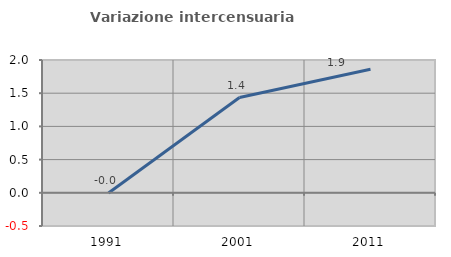
| Category | Variazione intercensuaria annua |
|---|---|
| 1991.0 | -0.004 |
| 2001.0 | 1.434 |
| 2011.0 | 1.861 |